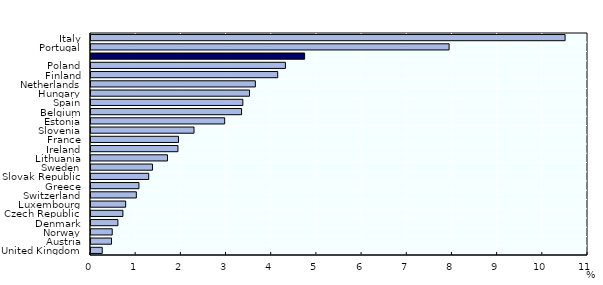
| Category | Share of non-employed persons |
|---|---|
| United Kingdom | 0.249 |
| Austria | 0.454 |
| Norway | 0.47 |
| Denmark | 0.595 |
| Czech Republic | 0.706 |
| Luxembourg | 0.768 |
| Switzerland | 1.003 |
| Greece | 1.061 |
| Slovak Republic | 1.277 |
| Sweden | 1.36 |
| Lithuania | 1.693 |
| Ireland | 1.924 |
| France | 1.937 |
| Slovenia | 2.28 |
| Estonia | 2.959 |
| Belgium | 3.333 |
| Spain | 3.36 |
| Hungary | 3.508 |
| Netherlands | 3.638 |
| Finland | 4.133 |
| Poland | 4.303 |
|  | 4.728 |
| Portugal | 7.926 |
| Italy | 10.493 |